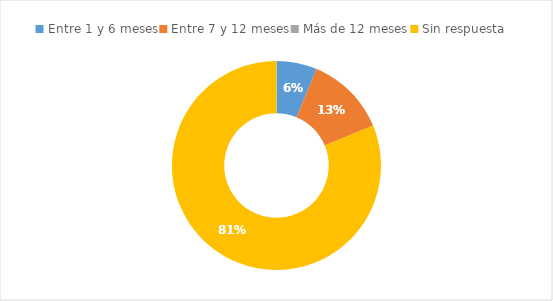
| Category | Series 0 |
|---|---|
| Entre 1 y 6 meses | 0.062 |
| Entre 7 y 12 meses | 0.125 |
| Más de 12 meses | 0 |
| Sin respuesta | 0.812 |